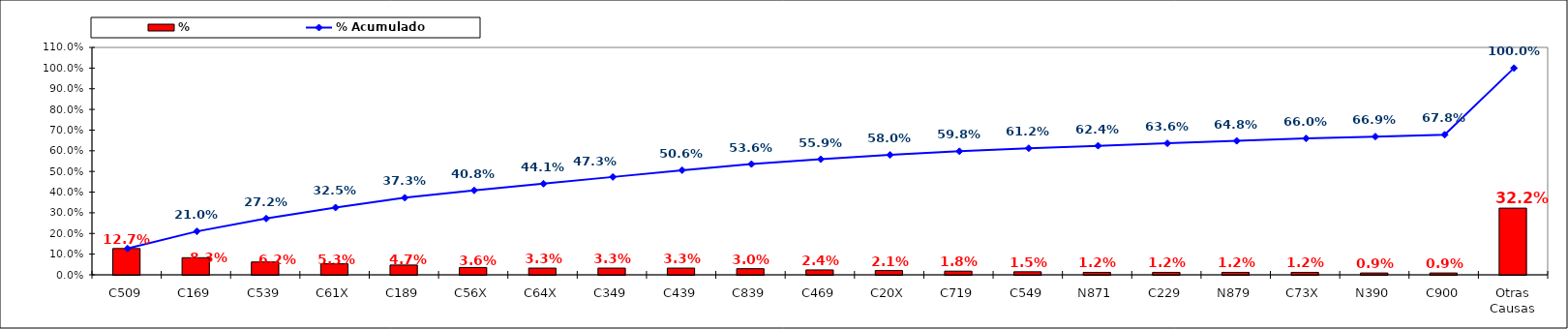
| Category | % |
|---|---|
| C509 | 0.127 |
| C169 | 0.083 |
| C539 | 0.062 |
| C61X | 0.053 |
| C189 | 0.047 |
| C56X | 0.036 |
| C64X | 0.033 |
| C349 | 0.033 |
| C439 | 0.033 |
| C839 | 0.03 |
| C469 | 0.024 |
| C20X | 0.021 |
| C719 | 0.018 |
| C549 | 0.015 |
| N871 | 0.012 |
| C229 | 0.012 |
| N879 | 0.012 |
| C73X | 0.012 |
| N390 | 0.009 |
| C900 | 0.009 |
| Otras Causas | 0.322 |